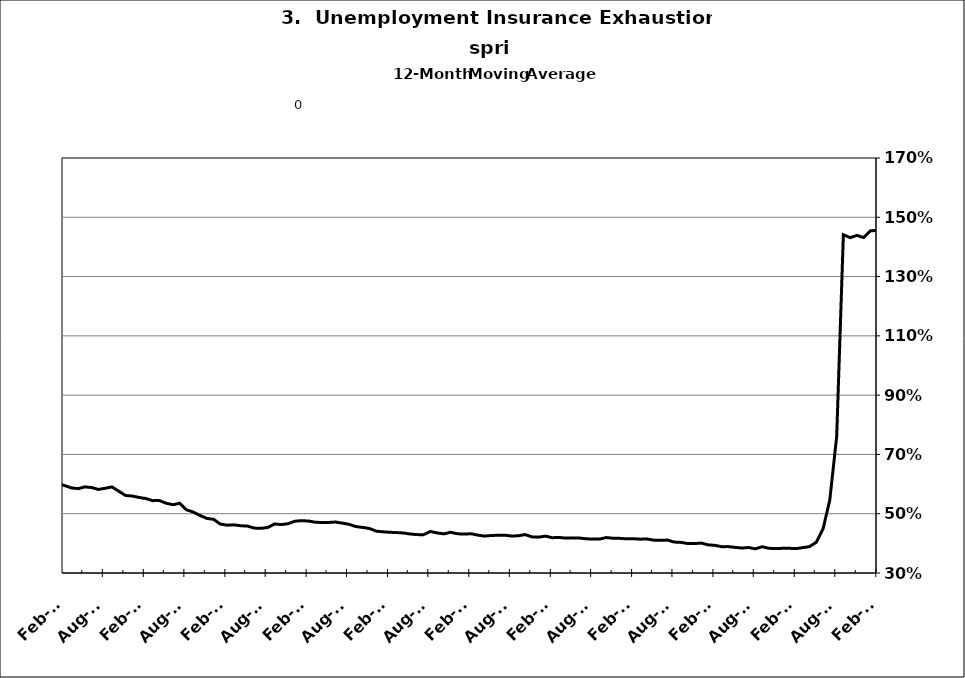
| Category | Series 0 |
|---|---|
| 2002-12-31 | 0.428 |
| 2003-01-31 | 0.432 |
| 2003-02-28 | 0.437 |
| 2003-03-31 | 0.445 |
| 2003-04-30 | 0.455 |
| 2003-05-31 | 0.466 |
| 2003-06-30 | 0.475 |
| 2003-07-31 | 0.485 |
| 2003-08-31 | 0.499 |
| 2003-09-30 | 0.502 |
| 2003-10-31 | 0.5 |
| 2003-11-30 | 0.506 |
| 2003-12-31 | 0.505 |
| 2004-01-31 | 0.505 |
| 2004-02-29 | 0.507 |
| 2004-03-31 | 0.501 |
| 2004-04-30 | 0.491 |
| 2004-05-31 | 0.486 |
| 2004-06-30 | 0.477 |
| 2004-07-31 | 0.466 |
| 2004-08-31 | 0.464 |
| 2004-09-30 | 0.452 |
| 2004-10-31 | 0.448 |
| 2004-11-30 | 0.44 |
| 2004-12-31 | 0.429 |
| 2005-01-31 | 0.429 |
| 2005-02-28 | 0.418 |
| 2005-03-31 | 0.412 |
| 2005-04-30 | 0.409 |
| 2005-05-31 | 0.404 |
| 2005-06-30 | 0.398 |
| 2005-07-31 | 0.4 |
| 2005-08-31 | 0.398 |
| 2005-09-30 | 0.398 |
| 2005-10-31 | 0.398 |
| 2005-11-30 | 0.392 |
| 2005-12-31 | 0.391 |
| 2006-01-31 | 0.388 |
| 2006-02-28 | 0.385 |
| 2006-03-31 | 0.381 |
| 2006-04-30 | 0.383 |
| 2006-05-31 | 0.387 |
| 2006-06-30 | 0.387 |
| 2006-07-31 | 0.393 |
| 2006-08-31 | 0.401 |
| 2006-09-30 | 0.415 |
| 2006-10-31 | 0.422 |
| 2006-11-30 | 0.423 |
| 2006-12-31 | 0.427 |
| 2007-01-31 | 0.425 |
| 2007-02-28 | 0.427 |
| 2007-03-31 | 0.431 |
| 2007-04-30 | 0.437 |
| 2007-05-31 | 0.434 |
| 2007-06-30 | 0.436 |
| 2007-07-30 | 0.443 |
| 2007-08-31 | 0.435 |
| 2007-09-30 | 0.437 |
| 2007-10-31 | 0.433 |
| 2007-11-15 | 0.438 |
| 2007-12-15 09:36:00 | 0.446 |
| 2008-01-14 19:12:00 | 0.447 |
| 2008-02-14 04:48:00 | 0.455 |
| 2008-03-15 14:24:00 | 0.462 |
| 2008-04-15 | 0.462 |
| 2008-05-15 09:36:00 | 0.467 |
| 2008-06-14 19:12:00 | 0.475 |
| 2008-07-15 04:48:00 | 0.47 |
| 2008-08-14 14:24:00 | 0.469 |
| 2008-09-14 | 0.473 |
| 2008-10-14 09:36:00 | 0.478 |
| 2008-11-13 19:12:00 | 0.489 |
| 2008-12-14 04:48:00 | 0.497 |
| 2009-01-13 14:24:00 | 0.51 |
| 2009-02-13 | 0.528 |
| 2009-03-15 09:36:00 | 0.547 |
| 2009-04-14 19:12:00 | 0.565 |
| 2009-05-15 04:48:00 | 0.582 |
| 2009-06-14 14:24:00 | 0.6 |
| 2009-07-15 | 0.611 |
| 2009-08-14 09:36:00 | 0.631 |
| 2009-09-13 19:12:00 | 0.623 |
| 2009-10-14 04:48:00 | 0.631 |
| 2009-11-13 14:24:00 | 0.65 |
| 2009-12-14 | 0.65 |
| 2010-01-13 09:36:00 | 0.657 |
| 2010-02-12 19:12:00 | 0.652 |
| 2010-03-15 04:48:00 | 0.649 |
| 2010-04-14 14:24:00 | 0.636 |
| 2010-05-15 | 0.623 |
| 2010-06-14 09:36:00 | 0.615 |
| 2010-07-14 19:12:00 | 0.604 |
| 2010-08-14 04:48:00 | 0.596 |
| 2010-09-13 14:24:00 | 0.591 |
| 2010-10-14 | 0.608 |
| 2010-11-13 09:36:00 | 0.605 |
| 2010-12-13 19:12:00 | 0.6 |
| 2011-01-13 04:48:00 | 0.602 |
| 2011-02-12 14:24:00 | 0.595 |
| 2011-03-15 | 0.587 |
| 2011-04-14 09:36:00 | 0.584 |
| 2011-05-14 19:12:00 | 0.591 |
| 2011-06-14 04:48:00 | 0.588 |
| 2011-07-14 14:24:00 | 0.582 |
| 2011-08-14 | 0.586 |
| 2011-09-13 09:36:00 | 0.59 |
| 2011-10-13 19:12:00 | 0.576 |
| 2011-11-13 04:48:00 | 0.561 |
| 2011-12-13 14:24:00 | 0.56 |
| 2012-01-13 | 0.555 |
| 2012-02-12 09:36:00 | 0.551 |
| 2012-03-13 19:12:00 | 0.544 |
| 2012-04-13 04:48:00 | 0.544 |
| 2012-05-13 14:24:00 | 0.535 |
| 2012-06-13 | 0.53 |
| 2012-07-13 09:36:00 | 0.535 |
| 2012-08-12 19:12:00 | 0.513 |
| 2012-09-12 04:48:00 | 0.506 |
| 2012-10-12 14:24:00 | 0.494 |
| 2012-11-12 | 0.484 |
| 2012-12-12 09:36:00 | 0.481 |
| 2013-01-11 19:12:00 | 0.465 |
| 2013-02-11 04:48:00 | 0.461 |
| 2013-03-13 14:24:00 | 0.462 |
| 2013-04-13 | 0.459 |
| 2013-05-13 09:36:00 | 0.458 |
| 2013-06-12 19:12:00 | 0.452 |
| 2013-07-13 04:48:00 | 0.451 |
| 2013-08-12 14:24:00 | 0.454 |
| 2013-09-12 | 0.465 |
| 2013-10-12 09:36:00 | 0.463 |
| 2013-11-11 19:12:00 | 0.466 |
| 2013-12-12 04:48:00 | 0.475 |
| 2014-01-11 14:24:00 | 0.477 |
| 2014-02-11 | 0.475 |
| 2014-03-13 09:36:00 | 0.471 |
| 2014-04-12 19:12:00 | 0.47 |
| 2014-05-13 04:48:00 | 0.471 |
| 2014-06-12 14:24:00 | 0.472 |
| 2014-07-13 | 0.468 |
| 2014-08-12 09:36:00 | 0.464 |
| 2014-09-11 19:12:00 | 0.457 |
| 2014-10-12 04:48:00 | 0.454 |
| 2014-11-11 14:24:00 | 0.45 |
| 2014-12-12 | 0.441 |
| 2015-01-11 09:36:00 | 0.439 |
| 2015-02-10 19:12:00 | 0.437 |
| 2015-03-13 04:48:00 | 0.436 |
| 2015-04-12 14:24:00 | 0.435 |
| 2015-05-13 | 0.432 |
| 2015-06-12 09:36:00 | 0.43 |
| 2015-07-12 19:12:00 | 0.429 |
| 2015-08-12 04:48:00 | 0.44 |
| 2015-09-11 14:24:00 | 0.435 |
| 2015-10-12 | 0.432 |
| 2015-11-11 09:36:00 | 0.437 |
| 2015-12-11 19:12:00 | 0.432 |
| 2016-01-11 04:48:00 | 0.431 |
| 2016-02-10 14:24:00 | 0.432 |
| 2016-03-12 | 0.428 |
| 2016-04-11 09:36:00 | 0.425 |
| 2016-05-11 19:12:00 | 0.426 |
| 2016-06-11 04:48:00 | 0.427 |
| 2016-07-11 14:24:00 | 0.428 |
| 2016-08-11 | 0.425 |
| 2016-09-10 09:36:00 | 0.426 |
| 2016-10-10 19:12:00 | 0.43 |
| 2016-11-10 04:48:00 | 0.422 |
| 2016-12-10 14:24:00 | 0.421 |
| 2017-01-10 | 0.424 |
| 2017-02-09 09:36:00 | 0.419 |
| 2017-03-11 19:12:00 | 0.42 |
| 2017-04-11 04:48:00 | 0.418 |
| 2017-05-11 14:24:00 | 0.418 |
| 2017-06-11 | 0.418 |
| 2017-07-11 09:36:00 | 0.415 |
| 2017-08-10 19:12:00 | 0.415 |
| 2017-09-10 04:48:00 | 0.414 |
| 2017-10-10 14:24:00 | 0.42 |
| 2017-11-10 | 0.417 |
| 2017-12-10 09:36:00 | 0.417 |
| 2018-01-09 19:12:00 | 0.415 |
| 2018-02-09 04:48:00 | 0.416 |
| 2018-03-11 14:24:00 | 0.414 |
| 2018-04-11 | 0.415 |
| 2018-05-11 09:36:00 | 0.411 |
| 2018-06-10 19:12:00 | 0.41 |
| 2018-07-11 04:48:00 | 0.411 |
| 2018-08-10 14:24:00 | 0.404 |
| 2018-09-10 | 0.403 |
| 2018-10-10 09:36:00 | 0.4 |
| 2018-11-09 19:12:00 | 0.399 |
| 2018-12-10 04:48:00 | 0.401 |
| 2019-01-09 14:24:00 | 0.395 |
| 2019-02-09 | 0.393 |
| 2019-03-11 09:36:00 | 0.389 |
| 2019-04-10 19:12:00 | 0.389 |
| 2019-05-11 04:48:00 | 0.386 |
| 2019-06-10 14:24:00 | 0.384 |
| 2019-07-11 | 0.386 |
| 2019-08-10 09:36:00 | 0.381 |
| 2019-09-09 19:12:00 | 0.389 |
| 2019-10-10 04:48:00 | 0.383 |
| 2019-11-09 14:24:00 | 0.382 |
| 2019-12-10 | 0.383 |
| 2020-01-09 09:36:00 | 0.383 |
| 2020-02-08 19:12:00 | 0.382 |
| 2020-03-10 04:48:00 | 0.386 |
| 2020-04-09 14:24:00 | 0.389 |
| 2020-05-10 | 0.404 |
| 2020-06-09 09:36:00 | 0.449 |
| 2020-07-09 19:12:00 | 0.546 |
| 2020-08-09 04:48:00 | 0.76 |
| 2020-09-08 14:24:00 | 1.441 |
| 2020-10-09 | 1.431 |
| 2020-11-08 09:36:00 | 1.439 |
| 2020-12-08 19:12:00 | 1.432 |
| 2021-01-08 04:48:00 | 1.455 |
| 2021-02-07 14:24:00 | 1.456 |